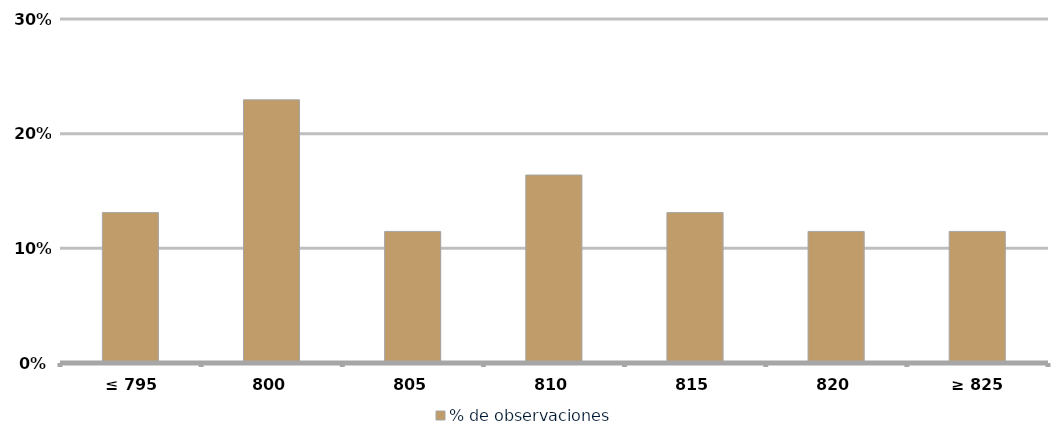
| Category | % de observaciones  |
|---|---|
|  ≤ 795  | 0.131 |
|  800  | 0.23 |
|  805  | 0.115 |
|  810  | 0.164 |
|  815  | 0.131 |
| 820 | 0.115 |
|  ≥ 825  | 0.115 |